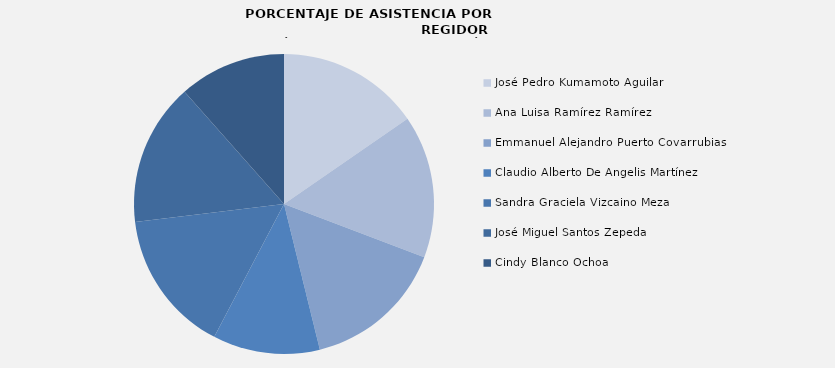
| Category | José Pedro Kumamoto Aguilar |
|---|---|
| José Pedro Kumamoto Aguilar | 100 |
| Ana Luisa Ramírez Ramírez | 100 |
| Emmanuel Alejandro Puerto Covarrubias  | 100 |
| Claudio Alberto De Angelis Martínez | 75 |
| Sandra Graciela Vizcaino Meza | 100 |
| José Miguel Santos Zepeda  | 100 |
| Cindy Blanco Ochoa  | 75 |